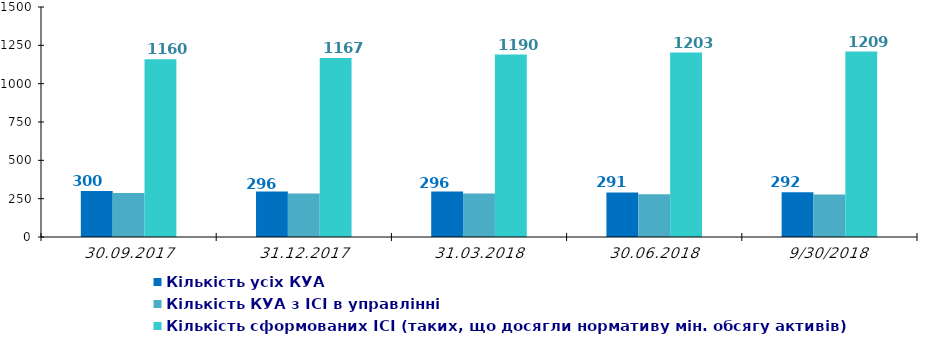
| Category | Кількість зареєстрованих ІСІ на одну КУА | Кількість усіх КУА | Кількість КУА з ІСІ в управлінні | Кількість сформованих ІСІ (таких, що досягли нормативу мін. обсягу активів)  |
|---|---|---|---|---|
| 30.09.2017 |  | 300 | 287 | 1160 |
| 31.12.2017 |  | 296 | 284 | 1167 |
| 31.03.2018 |  | 296 | 284 | 1190 |
| 30.06.2018 |  | 291 | 278 | 1203 |
| 30.09.2018 |  | 292 | 277 | 1209 |